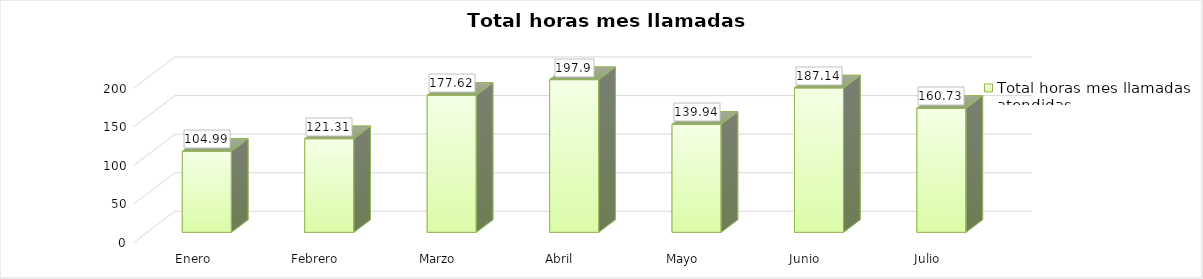
| Category | Total horas mes llamadas atendidas |
|---|---|
| Enero | 104.99 |
| Febrero | 121.31 |
| Marzo | 177.62 |
| Abril | 197.9 |
| Mayo | 139.94 |
| Junio | 187.14 |
| Julio | 160.73 |